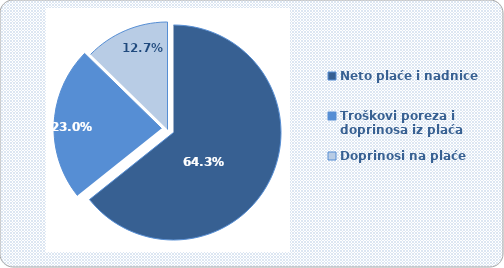
| Category | Series 0 |
|---|---|
| Neto plaće i nadnice | 64.273 |
| Troškovi poreza i doprinosa iz plaća | 23.038 |
| Doprinosi na plaće | 12.689 |